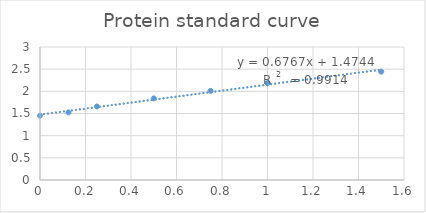
| Category | Series 0 |
|---|---|
| 1.5 | 2.444 |
| 1.0 | 2.186 |
| 0.75 | 2.01 |
| 0.5 | 1.84 |
| 0.25 | 1.658 |
| 0.125 | 1.524 |
| 0.0 | 1.45 |